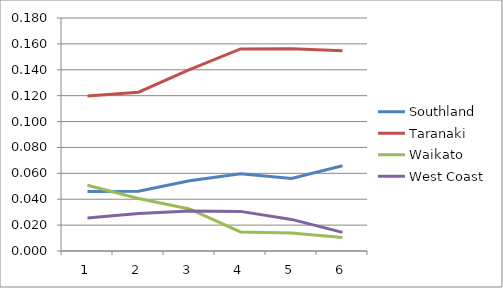
| Category | Southland | Taranaki | Waikato | West Coast |
|---|---|---|---|---|
| 0 | 0.046 | 0.12 | 0.051 | 0.025 |
| 1 | 0.046 | 0.123 | 0.041 | 0.029 |
| 2 | 0.054 | 0.14 | 0.033 | 0.031 |
| 3 | 0.06 | 0.156 | 0.015 | 0.031 |
| 4 | 0.056 | 0.156 | 0.014 | 0.024 |
| 5 | 0.066 | 0.155 | 0.01 | 0.014 |